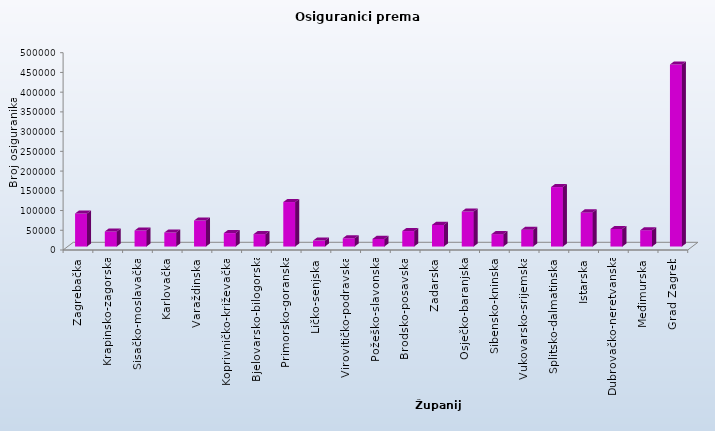
| Category | Series 0 |
|---|---|
| Zagrebačka | 83750 |
| Krapinsko-zagorska | 38175 |
| Sisačko-moslavačka | 40612 |
| Karlovačka | 35529 |
| Varaždinska | 65898 |
| Koprivničko-križevačka | 34085 |
| Bjelovarsko-bilogorska | 31365 |
| Primorsko-goranska | 112775 |
| Ličko-senjska | 15043 |
| Virovitičko-podravska | 20947 |
| Požeško-slavonska | 19303 |
| Brodsko-posavska | 39229 |
| Zadarska | 54860 |
| Osječko-baranjska | 88706 |
| Šibensko-kninska | 31391 |
| Vukovarsko-srijemska | 42503 |
| Splitsko-dalmatinska | 150710 |
| Istarska | 86547 |
| Dubrovačko-neretvanska | 44462 |
| Međimurska | 41393 |
| Grad Zagreb | 461338 |